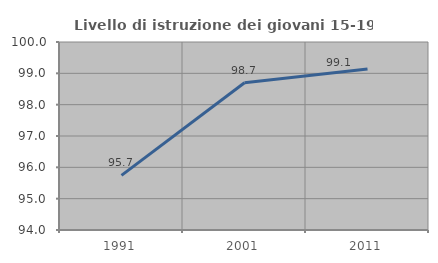
| Category | Livello di istruzione dei giovani 15-19 anni |
|---|---|
| 1991.0 | 95.745 |
| 2001.0 | 98.701 |
| 2011.0 | 99.138 |